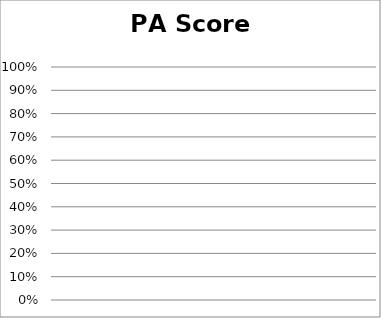
| Category | opening price | high price | low price | closing price |
|---|---|---|---|---|
|  | 0 | 0 | 0 | 0 |